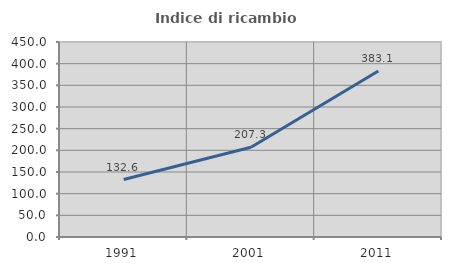
| Category | Indice di ricambio occupazionale  |
|---|---|
| 1991.0 | 132.632 |
| 2001.0 | 207.292 |
| 2011.0 | 383.065 |